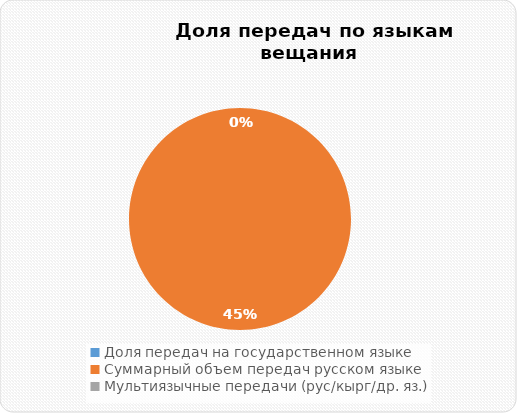
| Category | Series 0 |
|---|---|
| Доля передач на государственном языке | 0 |
| Суммарный объем передач русском языке | 0.447 |
| Мультиязычные передачи (рус/кырг/др. яз.) | 0 |